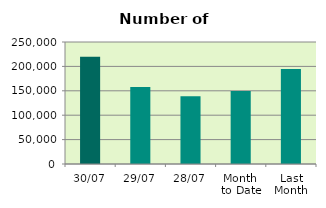
| Category | Series 0 |
|---|---|
| 30/07 | 219632 |
| 29/07 | 157642 |
| 28/07 | 138748 |
| Month 
to Date | 149594.636 |
| Last
Month | 194460.727 |